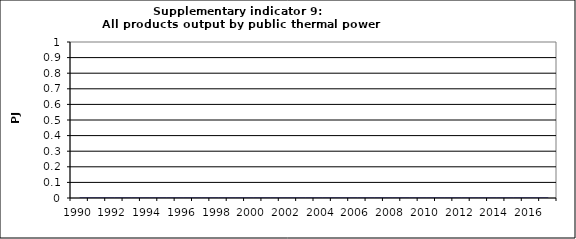
| Category | All products output by public thermal power stations, PJ |
|---|---|
| 1990 | 0 |
| 1991 | 0 |
| 1992 | 0 |
| 1993 | 0 |
| 1994 | 0 |
| 1995 | 0 |
| 1996 | 0 |
| 1997 | 0 |
| 1998 | 0 |
| 1999 | 0 |
| 2000 | 0 |
| 2001 | 0 |
| 2002 | 0 |
| 2003 | 0 |
| 2004 | 0 |
| 2005 | 0 |
| 2006 | 0 |
| 2007 | 0 |
| 2008 | 0 |
| 2009 | 0 |
| 2010 | 0 |
| 2011 | 0 |
| 2012 | 0 |
| 2013 | 0 |
| 2014 | 0 |
| 2015 | 0 |
| 2016 | 0 |
| 2017 | 0 |